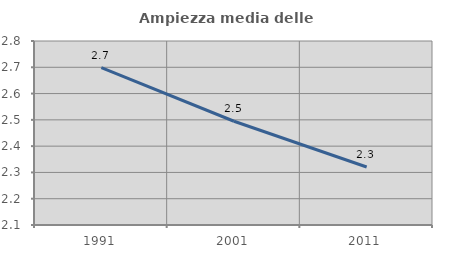
| Category | Ampiezza media delle famiglie |
|---|---|
| 1991.0 | 2.699 |
| 2001.0 | 2.495 |
| 2011.0 | 2.321 |